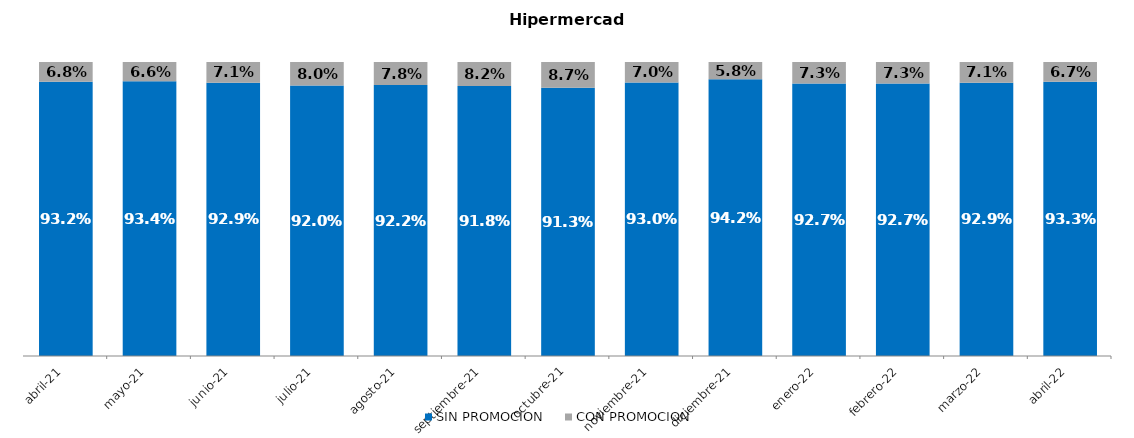
| Category | SIN PROMOCION   | CON PROMOCION   |
|---|---|---|
| 2021-04-01 | 0.932 | 0.068 |
| 2021-05-01 | 0.934 | 0.066 |
| 2021-06-01 | 0.929 | 0.071 |
| 2021-07-01 | 0.92 | 0.08 |
| 2021-08-01 | 0.922 | 0.078 |
| 2021-09-01 | 0.918 | 0.082 |
| 2021-10-01 | 0.913 | 0.087 |
| 2021-11-01 | 0.93 | 0.07 |
| 2021-12-01 | 0.942 | 0.058 |
| 2022-01-01 | 0.927 | 0.073 |
| 2022-02-01 | 0.927 | 0.073 |
| 2022-03-01 | 0.929 | 0.071 |
| 2022-04-01 | 0.933 | 0.067 |